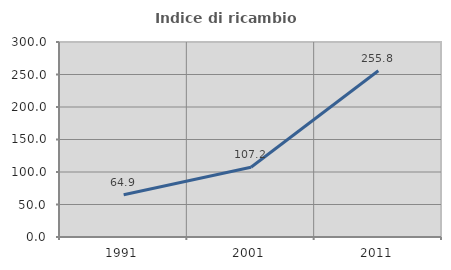
| Category | Indice di ricambio occupazionale  |
|---|---|
| 1991.0 | 64.936 |
| 2001.0 | 107.22 |
| 2011.0 | 255.829 |